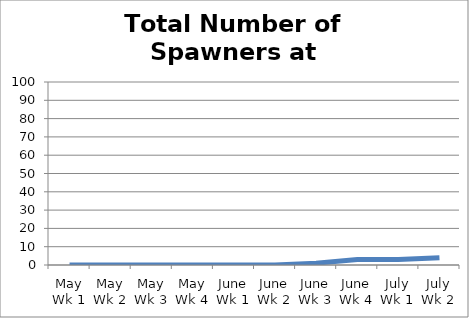
| Category | Number of Spawners |
|---|---|
| May Wk 1 | 0 |
| May Wk 2 | 0 |
| May Wk 3 | 0 |
| May Wk 4 | 0 |
| June Wk 1 | 0 |
| June Wk 2 | 0 |
| June Wk 3 | 1 |
| June Wk 4 | 3 |
| July Wk 1 | 3 |
| July Wk 2 | 4 |